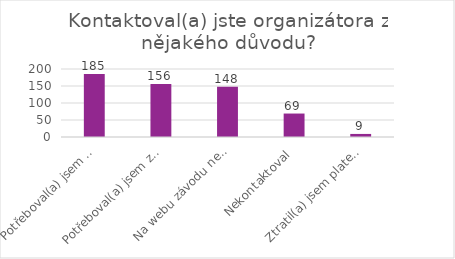
| Category | Series 0 |
|---|---|
| Potřeboval(a) jsem upravit svoje údaje v registraci | 185 |
| Potřeboval(a) jsem zrušit vaši registraci v závodu úplně | 156 |
| Na webu závodu nebyly potřebné informace | 148 |
| Nekontaktoval | 69 |
| Ztratil(a) jsem platební údaje | 9 |